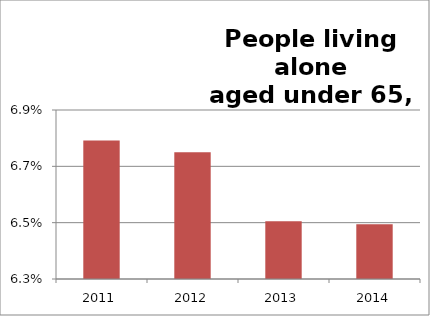
| Category | Series 1 |
|---|---|
| 2011.0 | 0.068 |
| 2012.0 | 0.068 |
| 2013.0 | 0.065 |
| 2014.0 | 0.065 |